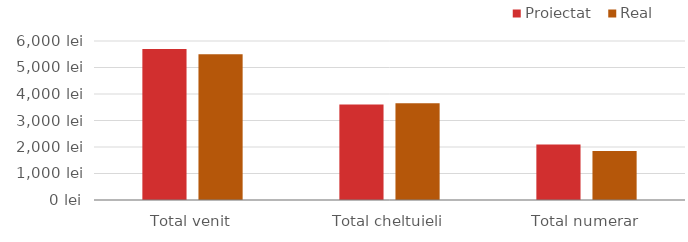
| Category | Proiectat | Real |
|---|---|---|
| Total venit | 5700 | 5500 |
| Total cheltuieli | 3603 | 3655 |
| Total numerar | 2097 | 1845 |